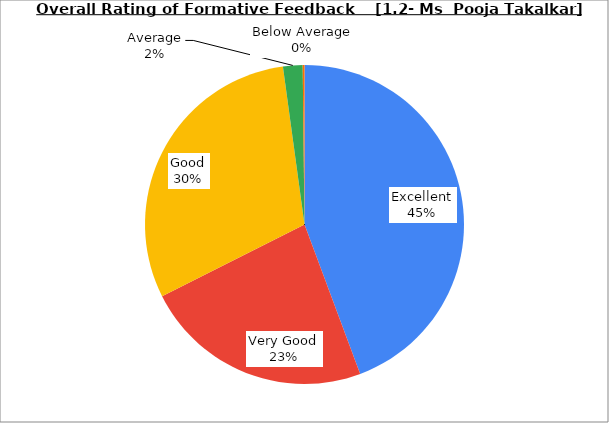
| Category | Series 0 |
|---|---|
| Excellent | 44.324 |
| Very Good | 23.243 |
| Good | 30.27 |
| Average | 1.982 |
| Below Average | 0.18 |